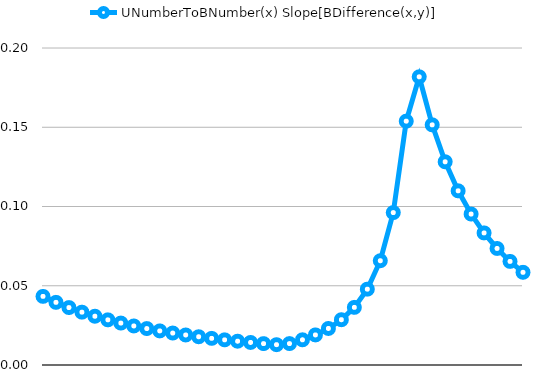
| Category | Slope[BDifference(x,y)] |
|---|---|
|  | 0.043 |
|  | 0.04 |
|  | 0.036 |
|  | 0.033 |
|  | 0.031 |
|  | 0.028 |
|  | 0.026 |
|  | 0.025 |
|  | 0.023 |
|  | 0.022 |
|  | 0.02 |
|  | 0.019 |
|  | 0.018 |
|  | 0.017 |
|  | 0.016 |
|  | 0.015 |
|  | 0.014 |
|  | 0.013 |
|  | 0.013 |
|  | 0.014 |
|  | 0.016 |
|  | 0.019 |
|  | 0.023 |
|  | 0.029 |
|  | 0.036 |
|  | 0.048 |
|  | 0.066 |
|  | 0.096 |
|  | 0.154 |
|  | 0.182 |
|  | 0.152 |
|  | 0.128 |
|  | 0.11 |
|  | 0.095 |
|  | 0.083 |
|  | 0.074 |
|  | 0.065 |
|  | 0.058 |